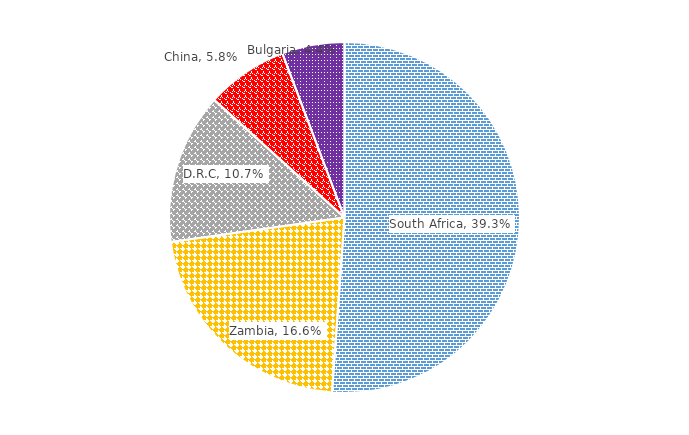
| Category | %Share |
|---|---|
| South Africa | 0.393 |
| Zambia | 0.166 |
| D.R.C | 0.107 |
| China | 0.058 |
| Bulgaria | 0.044 |